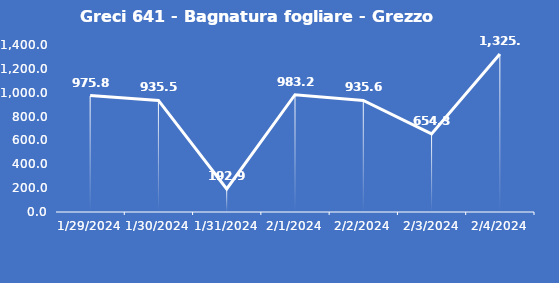
| Category | Greci 641 - Bagnatura fogliare - Grezzo (min) |
|---|---|
| 1/29/24 | 975.8 |
| 1/30/24 | 935.5 |
| 1/31/24 | 192.9 |
| 2/1/24 | 983.2 |
| 2/2/24 | 935.6 |
| 2/3/24 | 654.3 |
| 2/4/24 | 1325.2 |